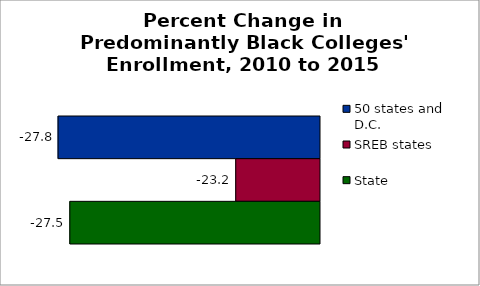
| Category | 50 states and D.C. | SREB states | State |
|---|---|---|---|
| 2012 to 2017 | -27.769 | -23.168 | -27.464 |